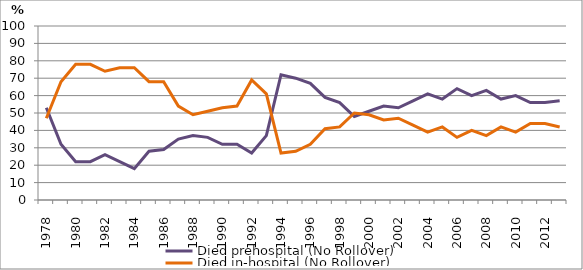
| Category | Died prehospital (No Rollover) | Died in-hospital (No Rollover) |
|---|---|---|
| 1978.0 | 53 | 47 |
| 1979.0 | 32 | 68 |
| 1980.0 | 22 | 78 |
| 1981.0 | 22 | 78 |
| 1982.0 | 26 | 74 |
| 1983.0 | 22 | 76 |
| 1984.0 | 18 | 76 |
| 1985.0 | 28 | 68 |
| 1986.0 | 29 | 68 |
| 1987.0 | 35 | 54 |
| 1988.0 | 37 | 49 |
| 1989.0 | 36 | 51 |
| 1990.0 | 32 | 53 |
| 1991.0 | 32 | 54 |
| 1992.0 | 27 | 69 |
| 1993.0 | 37 | 61 |
| 1994.0 | 72 | 27 |
| 1995.0 | 70 | 28 |
| 1996.0 | 67 | 32 |
| 1997.0 | 59 | 41 |
| 1998.0 | 56 | 42 |
| 1999.0 | 48 | 50 |
| 2000.0 | 51 | 49 |
| 2001.0 | 54 | 46 |
| 2002.0 | 53 | 47 |
| 2003.0 | 57 | 43 |
| 2004.0 | 61 | 39 |
| 2005.0 | 58 | 42 |
| 2006.0 | 64 | 36 |
| 2007.0 | 60 | 40 |
| 2008.0 | 63 | 37 |
| 2009.0 | 58 | 42 |
| 2010.0 | 60 | 39 |
| 2011.0 | 56 | 44 |
| 2012.0 | 56 | 44 |
| 2013.0 | 57 | 42 |